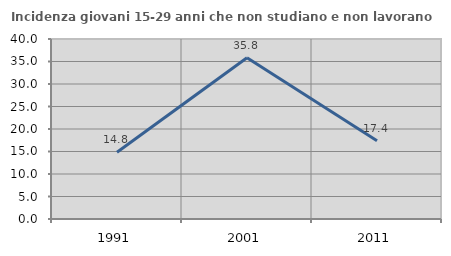
| Category | Incidenza giovani 15-29 anni che non studiano e non lavorano  |
|---|---|
| 1991.0 | 14.817 |
| 2001.0 | 35.849 |
| 2011.0 | 17.391 |